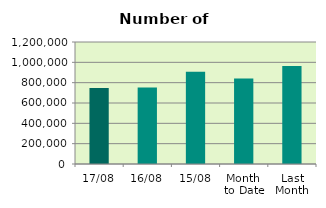
| Category | Series 0 |
|---|---|
| 17/08 | 748276 |
| 16/08 | 752318 |
| 15/08 | 906932 |
| Month 
to Date | 841763.692 |
| Last
Month | 964212.818 |